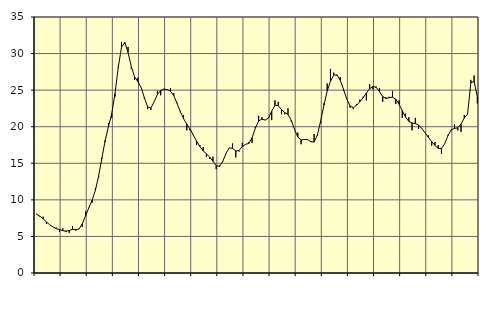
| Category | Piggar | Series 1 |
|---|---|---|
| nan | 8.1 | 8.03 |
| 87.0 | 7.7 | 7.77 |
| 87.0 | 7.7 | 7.41 |
| 87.0 | 6.7 | 6.98 |
| nan | 6.6 | 6.59 |
| 88.0 | 6.3 | 6.3 |
| 88.0 | 6.2 | 6.07 |
| 88.0 | 5.6 | 5.94 |
| nan | 6.1 | 5.79 |
| 89.0 | 5.6 | 5.72 |
| 89.0 | 5.5 | 5.81 |
| 89.0 | 6.4 | 5.96 |
| nan | 5.8 | 5.94 |
| 90.0 | 6 | 6.02 |
| 90.0 | 6.3 | 6.72 |
| 90.0 | 8.4 | 7.83 |
| nan | 8.9 | 8.93 |
| 91.0 | 9.6 | 9.96 |
| 91.0 | 11.6 | 11.31 |
| 91.0 | 13.1 | 13.29 |
| nan | 15.6 | 15.74 |
| 92.0 | 17.9 | 18.13 |
| 92.0 | 20.5 | 20.02 |
| 92.0 | 21.2 | 21.78 |
| nan | 24.1 | 24.54 |
| 93.0 | 28.2 | 28.1 |
| 93.0 | 31.6 | 30.88 |
| 93.0 | 31.3 | 31.52 |
| nan | 30.9 | 30.16 |
| 94.0 | 27.9 | 28.22 |
| 94.0 | 26.4 | 26.83 |
| 94.0 | 26.7 | 26.17 |
| nan | 25.4 | 25.38 |
| 95.0 | 23.8 | 23.96 |
| 95.0 | 22.4 | 22.71 |
| 95.0 | 22.3 | 22.57 |
| nan | 23.4 | 23.41 |
| 96.0 | 24.9 | 24.41 |
| 96.0 | 24.3 | 24.97 |
| 96.0 | 25.2 | 25.11 |
| nan | 25.1 | 25.09 |
| 97.0 | 25.3 | 24.86 |
| 97.0 | 24.6 | 24.24 |
| 97.0 | 23.3 | 23.21 |
| nan | 22 | 22.08 |
| 98.0 | 21.6 | 21.11 |
| 98.0 | 19.5 | 20.34 |
| 98.0 | 19.5 | 19.67 |
| nan | 18.8 | 18.85 |
| 99.0 | 17.5 | 18.04 |
| 99.0 | 17.5 | 17.29 |
| 99.0 | 17.2 | 16.7 |
| nan | 15.9 | 16.29 |
| 0.0 | 15.6 | 15.86 |
| 0.0 | 15.9 | 15.28 |
| 0.0 | 14.2 | 14.68 |
| nan | 14.7 | 14.58 |
| 1.0 | 15.3 | 15.24 |
| 1.0 | 16.3 | 16.35 |
| 1.0 | 17.1 | 17.11 |
| nan | 17.7 | 17.05 |
| 2.0 | 15.8 | 16.68 |
| 2.0 | 16.6 | 16.76 |
| 2.0 | 17.8 | 17.27 |
| nan | 17.6 | 17.59 |
| 3.0 | 17.9 | 17.72 |
| 3.0 | 17.8 | 18.48 |
| 3.0 | 20 | 19.8 |
| nan | 21.5 | 20.78 |
| 4.0 | 21.3 | 21.03 |
| 4.0 | 20.9 | 20.91 |
| 4.0 | 21.2 | 21.18 |
| nan | 20.9 | 22.11 |
| 5.0 | 23.6 | 22.92 |
| 5.0 | 23.4 | 22.88 |
| 5.0 | 21.7 | 22.33 |
| nan | 21.7 | 21.95 |
| 6.0 | 22.5 | 21.67 |
| 6.0 | 20.7 | 20.88 |
| 6.0 | 19.6 | 19.62 |
| nan | 19.2 | 18.58 |
| 7.0 | 17.6 | 18.2 |
| 7.0 | 18.3 | 18.25 |
| 7.0 | 18.2 | 18.24 |
| nan | 17.9 | 17.95 |
| 8.0 | 19 | 17.9 |
| 8.0 | 18.8 | 18.86 |
| 8.0 | 20.5 | 20.79 |
| nan | 23.2 | 22.95 |
| 9.0 | 25.9 | 24.87 |
| 9.0 | 27.9 | 26.22 |
| 9.0 | 27.4 | 27.05 |
| nan | 27 | 27.09 |
| 10.0 | 26.8 | 26.35 |
| 10.0 | 24.9 | 25.12 |
| 10.0 | 23.8 | 23.79 |
| nan | 22.6 | 22.85 |
| 11.0 | 22.4 | 22.59 |
| 11.0 | 23.1 | 22.93 |
| 11.0 | 23.7 | 23.41 |
| nan | 24.1 | 23.95 |
| 12.0 | 23.6 | 24.62 |
| 12.0 | 25.8 | 25.18 |
| 12.0 | 25.1 | 25.52 |
| nan | 25.5 | 25.38 |
| 13.0 | 25.3 | 24.8 |
| 13.0 | 23.4 | 24.13 |
| 13.0 | 24 | 23.86 |
| nan | 24.1 | 23.96 |
| 14.0 | 24.9 | 24.04 |
| 14.0 | 23.1 | 23.77 |
| 14.0 | 23.6 | 23.07 |
| nan | 21.2 | 22.2 |
| 15.0 | 21.8 | 21.32 |
| 15.0 | 21.3 | 20.73 |
| 15.0 | 19.5 | 20.51 |
| nan | 21.2 | 20.43 |
| 16.0 | 19.7 | 20.24 |
| 16.0 | 19.8 | 19.76 |
| 16.0 | 19.2 | 19.16 |
| nan | 18.8 | 18.54 |
| 17.0 | 17.4 | 17.96 |
| 17.0 | 17.9 | 17.45 |
| 17.0 | 17.5 | 17.04 |
| nan | 16.3 | 17.01 |
| 18.0 | 17.7 | 17.69 |
| 18.0 | 18.9 | 18.79 |
| 18.0 | 19.5 | 19.59 |
| nan | 20.3 | 19.77 |
| 19.0 | 19.5 | 19.85 |
| 19.0 | 19.3 | 20.38 |
| 19.0 | 21.6 | 21.18 |
| nan | 21.7 | 21.72 |
| 20.0 | 26.4 | 26.02 |
| 20.0 | 27 | 26.17 |
| 20.0 | 23.2 | 24.08 |